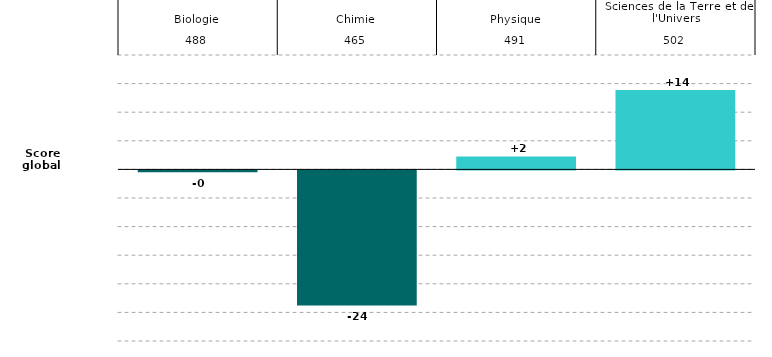
| Category | Series 0 |
|---|---|
| 0 | -0.323 |
| 1 | -23.607 |
| 2 | 2.262 |
| 3 | 13.875 |